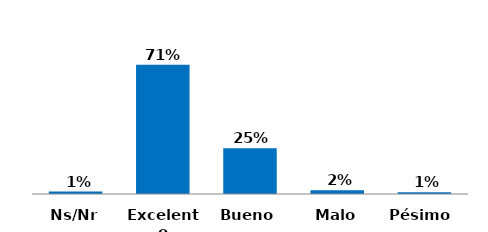
| Category | Series 0 |
|---|---|
| Pésimo  | 0.01 |
| Malo | 0.02 |
| Bueno | 0.25 |
| Excelente | 0.707 |
| Ns/Nr | 0.013 |